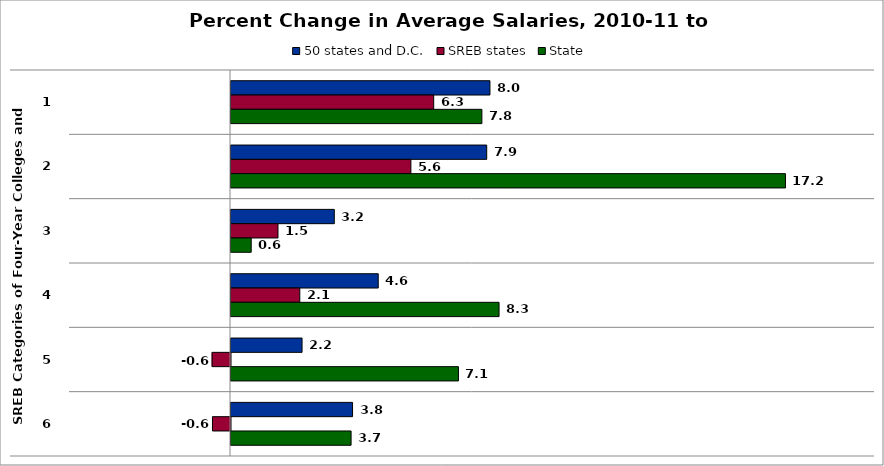
| Category | 50 states and D.C. | SREB states | State |
|---|---|---|---|
| 0 | 8.042 | 6.295 | 7.791 |
| 1 | 7.942 | 5.587 | 17.219 |
| 2 | 3.208 | 1.46 | 0.628 |
| 3 | 4.573 | 2.136 | 8.325 |
| 4 | 2.207 | -0.571 | 7.063 |
| 5 | 3.775 | -0.56 | 3.729 |